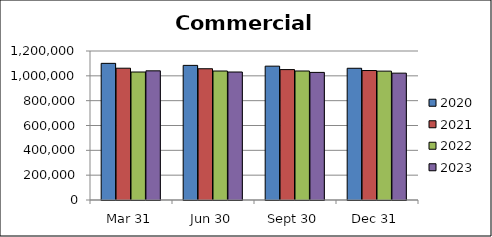
| Category | 2020 | 2021 | 2022 | 2023 |
|---|---|---|---|---|
| Mar 31 | 1100571 | 1061377 | 1030778 | 1040225 |
| Jun 30 | 1084205 | 1057169 | 1038875 | 1030842 |
| Sept 30 | 1077849 | 1050197 | 1038978 | 1027610 |
| Dec 31 | 1060893 | 1042661 | 1037906 | 1021684 |